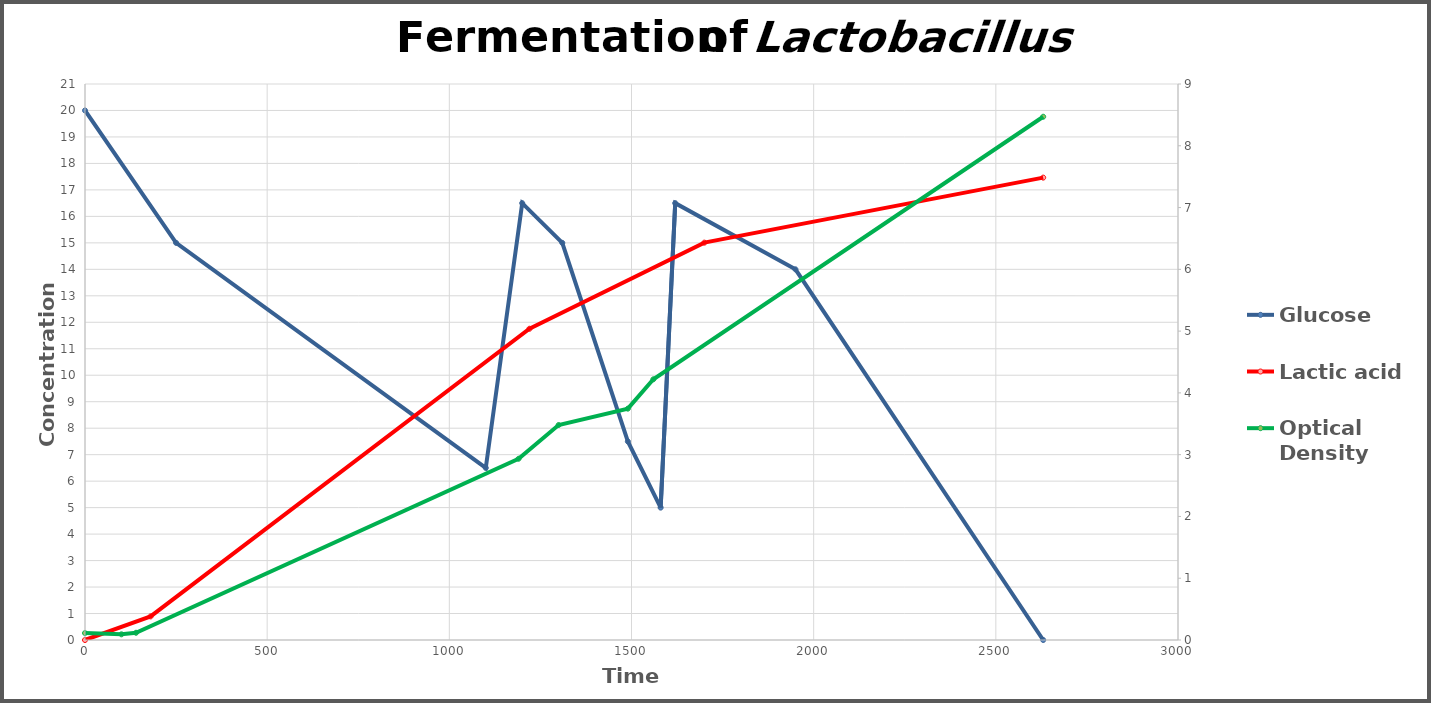
| Category | Glucose |
|---|---|
| 0.0 | 20 |
| 250.0 | 15 |
| 1100.0 | 6.5 |
| 1200.0 | 16.5 |
| 1310.0 | 15 |
| 1490.0 | 7.5 |
| 1580.0 | 5 |
| 1620.0 | 16.5 |
| 1950.0 | 14 |
| 2630.0 | 0 |
| nan | 0 |
| nan | 0 |
| nan | 0 |
| nan | 0 |